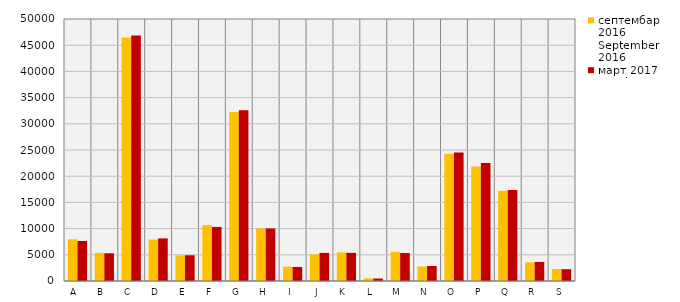
| Category | септембар 2016
September 2016 | март 2017
March 2017 |
|---|---|---|
| A  | 7969 | 7634 |
| B  | 5366 | 5292 |
| C  | 46490 | 46842 |
| D  | 7906 | 8129 |
| Е  | 4880 | 4912 |
| F  | 10677 | 10317 |
| G  | 32236 | 32594 |
| H  | 10004 | 10033 |
| I  | 2722 | 2679 |
| J  | 5074 | 5360 |
| K  | 5460 | 5374 |
| L  | 499 | 473 |
| M  | 5564 | 5347 |
| N  | 2764 | 2860 |
| O  | 24304 | 24500 |
| P  | 21874 | 22501 |
| Q  | 17245 | 17380 |
| R  | 3565 | 3639 |
| S  | 2282 | 2247 |